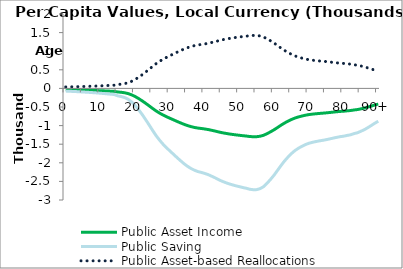
| Category | Public Asset Income | Public Saving | Public Asset-based Reallocations |
|---|---|---|---|
| 0 | -34.7 | -72.727 | 38.028 |
|  | -36.704 | -76.929 | 40.225 |
| 2 | -38.825 | -81.373 | 42.548 |
| 3 | -41.076 | -86.091 | 45.016 |
| 4 | -43.543 | -91.262 | 47.719 |
| 5 | -46.193 | -96.816 | 50.623 |
| 6 | -49.006 | -102.712 | 53.706 |
| 7 | -51.884 | -108.745 | 56.86 |
| 8 | -55.016 | -115.309 | 60.293 |
| 9 | -58.393 | -122.386 | 63.993 |
| 10 | -62.083 | -130.12 | 68.037 |
| 11 | -65.923 | -138.168 | 72.245 |
| 12 | -70.345 | -147.438 | 77.092 |
| 13 | -74.671 | -156.504 | 81.833 |
| 14 | -78.794 | -165.144 | 86.351 |
| 15 | -95.804 | -200.797 | 104.993 |
| 16 | -104.635 | -219.306 | 114.671 |
| 17 | -118.227 | -247.794 | 129.566 |
| 18 | -140.394 | -294.254 | 153.86 |
| 19 | -174.065 | -364.824 | 190.759 |
| 20 | -219.33 | -459.695 | 240.366 |
| 21 | -273.776 | -573.811 | 300.034 |
| 22 | -334.086 | -700.216 | 366.129 |
| 23 | -399.48 | -837.274 | 437.795 |
| 24 | -467.797 | -980.462 | 512.664 |
| 25 | -537.63 | -1126.826 | 589.196 |
| 26 | -604.453 | -1266.881 | 662.428 |
| 27 | -662.696 | -1388.953 | 726.257 |
| 28 | -714.564 | -1497.663 | 783.099 |
| 29 | -759.838 | -1592.552 | 832.714 |
| 30 | -802.619 | -1682.218 | 879.599 |
| 31 | -843.594 | -1768.098 | 924.504 |
| 32 | -885.332 | -1855.577 | 970.245 |
| 33 | -924.892 | -1938.493 | 1013.6 |
| 34 | -963.418 | -2019.239 | 1055.821 |
| 35 | -996.798 | -2089.199 | 1092.401 |
| 36 | -1025.821 | -2150.029 | 1124.208 |
| 37 | -1047.94 | -2196.388 | 1148.448 |
| 38 | -1065.832 | -2233.89 | 1168.058 |
| 39 | -1077.198 | -2257.712 | 1180.514 |
| 40 | -1089.925 | -2284.386 | 1194.461 |
| 41 | -1105.65 | -2317.345 | 1211.695 |
| 42 | -1125.653 | -2359.269 | 1233.616 |
| 43 | -1146.309 | -2402.563 | 1256.254 |
| 44 | -1169.55 | -2451.273 | 1281.723 |
| 45 | -1190.462 | -2495.102 | 1304.64 |
| 46 | -1207.653 | -2531.133 | 1323.48 |
| 47 | -1223.532 | -2564.414 | 1340.882 |
| 48 | -1236.793 | -2592.208 | 1355.415 |
| 49 | -1249.713 | -2619.288 | 1369.575 |
| 50 | -1260.231 | -2641.333 | 1381.102 |
| 51 | -1271.51 | -2664.972 | 1393.462 |
| 52 | -1280.774 | -2684.389 | 1403.615 |
| 53 | -1293.848 | -2711.791 | 1417.943 |
| 54 | -1299.143 | -2722.887 | 1423.744 |
| 55 | -1298.276 | -2721.072 | 1422.796 |
| 56 | -1285.322 | -2693.921 | 1408.599 |
| 57 | -1259.105 | -2638.971 | 1379.866 |
| 58 | -1215.761 | -2548.127 | 1332.366 |
| 59 | -1166.185 | -2444.22 | 1278.035 |
| 60 | -1112.126 | -2330.917 | 1218.791 |
| 61 | -1050.88 | -2202.551 | 1151.671 |
| 62 | -988.848 | -2072.537 | 1083.689 |
| 63 | -931.172 | -1951.654 | 1020.482 |
| 64 | -880.994 | -1846.486 | 965.492 |
| 65 | -835.673 | -1751.497 | 915.824 |
| 66 | -797.656 | -1671.816 | 874.16 |
| 67 | -767.609 | -1608.84 | 841.231 |
| 68 | -743.199 | -1557.679 | 814.48 |
| 69 | -721.12 | -1511.403 | 790.283 |
| 70 | -704.084 | -1475.699 | 771.614 |
| 71 | -692.097 | -1450.574 | 758.477 |
| 72 | -681.992 | -1429.394 | 747.402 |
| 73 | -673.497 | -1411.59 | 738.093 |
| 74 | -666.132 | -1396.153 | 730.021 |
| 75 | -657.603 | -1378.277 | 720.674 |
| 76 | -648.057 | -1358.269 | 710.212 |
| 77 | -637.844 | -1336.865 | 699.021 |
| 78 | -628.058 | -1316.354 | 688.296 |
| 79 | -619.102 | -1297.582 | 678.48 |
| 80 | -613.223 | -1285.261 | 672.038 |
| 81 | -603.614 | -1265.122 | 661.508 |
| 82 | -595.229 | -1247.547 | 652.318 |
| 83 | -579.967 | -1215.559 | 635.592 |
| 84 | -569.1 | -1192.784 | 623.684 |
| 85 | -549.513 | -1151.731 | 602.218 |
| 86 | -529.317 | -1109.401 | 580.084 |
| 87 | -503.154 | -1054.567 | 551.413 |
| 88 | -475.771 | -997.173 | 521.402 |
| 89 | -446.712 | -936.269 | 489.557 |
| 90+ | -421.15 | -882.692 | 461.542 |